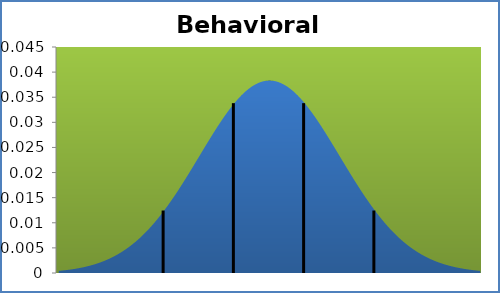
| Category | densité |
|---|---|
| 3.169999999999998 | 0 |
| 3.6904999999999966 | 0 |
| 4.2109999999999985 | 0.001 |
| 4.731499999999997 | 0.001 |
| 5.251999999999995 | 0.001 |
| 5.772500000000001 | 0.001 |
| 6.292999999999999 | 0.001 |
| 6.813499999999998 | 0.001 |
| 7.333999999999996 | 0.001 |
| 7.854500000000002 | 0.001 |
| 8.375 | 0.002 |
| 8.895499999999998 | 0.002 |
| 9.415999999999997 | 0.002 |
| 9.936499999999999 | 0.002 |
| 10.456999999999997 | 0.003 |
| 10.9775 | 0.003 |
| 11.497999999999998 | 0.003 |
| 12.0185 | 0.004 |
| 12.538999999999998 | 0.004 |
| 13.0595 | 0.005 |
| 13.579999999999998 | 0.005 |
| 14.100499999999997 | 0.006 |
| 14.620999999999999 | 0.006 |
| 15.141499999999997 | 0.007 |
| 15.661999999999999 | 0.008 |
| 16.182499999999997 | 0.008 |
| 16.703 | 0.009 |
| 17.223499999999998 | 0.01 |
| 17.744 | 0.011 |
| 18.264499999999998 | 0.012 |
| 18.784999999999997 | 0.012 |
| 19.3055 | 0.013 |
| 19.825999999999997 | 0.014 |
| 20.3465 | 0.015 |
| 20.866999999999997 | 0.016 |
| 21.3875 | 0.018 |
| 21.907999999999998 | 0.019 |
| 22.4285 | 0.02 |
| 22.948999999999998 | 0.021 |
| 23.469499999999996 | 0.022 |
| 23.99 | 0.023 |
| 24.5105 | 0.024 |
| 25.031 | 0.026 |
| 25.551499999999997 | 0.027 |
| 26.072 | 0.028 |
| 26.592499999999998 | 0.029 |
| 27.113 | 0.03 |
| 27.633499999999998 | 0.031 |
| 28.153999999999996 | 0.032 |
| 28.6745 | 0.033 |
| 29.195 | 0.034 |
| 29.7155 | 0.035 |
| 30.235999999999997 | 0.035 |
| 30.7565 | 0.036 |
| 31.276999999999997 | 0.037 |
| 31.7975 | 0.037 |
| 32.318 | 0.038 |
| 32.838499999999996 | 0.038 |
| 33.359 | 0.038 |
| 33.8795 | 0.038 |
| 34.4 | 0.038 |
| 34.9205 | 0.038 |
| 35.440999999999995 | 0.038 |
| 35.9615 | 0.038 |
| 36.482 | 0.038 |
| 37.0025 | 0.037 |
| 37.522999999999996 | 0.037 |
| 38.0435 | 0.036 |
| 38.564 | 0.035 |
| 39.0845 | 0.035 |
| 39.605 | 0.034 |
| 40.1255 | 0.033 |
| 40.646 | 0.032 |
| 41.1665 | 0.031 |
| 41.687 | 0.03 |
| 42.207499999999996 | 0.029 |
| 42.727999999999994 | 0.028 |
| 43.2485 | 0.027 |
| 43.769 | 0.026 |
| 44.2895 | 0.024 |
| 44.81 | 0.023 |
| 45.3305 | 0.022 |
| 45.851 | 0.021 |
| 46.3715 | 0.02 |
| 46.891999999999996 | 0.019 |
| 47.412499999999994 | 0.018 |
| 47.933 | 0.016 |
| 48.4535 | 0.015 |
| 48.974000000000004 | 0.014 |
| 49.4945 | 0.013 |
| 50.015 | 0.012 |
| 50.5355 | 0.012 |
| 51.056 | 0.011 |
| 51.576499999999996 | 0.01 |
| 52.096999999999994 | 0.009 |
| 52.6175 | 0.008 |
| 53.138 | 0.008 |
| 53.658500000000004 | 0.007 |
| 54.179 | 0.006 |
| 54.6995 | 0.006 |
| 55.22 | 0.005 |
| 55.7405 | 0.005 |
| 56.260999999999996 | 0.004 |
| 56.781499999999994 | 0.004 |
| 57.302 | 0.003 |
| 57.8225 | 0.003 |
| 58.343 | 0.003 |
| 58.8635 | 0.002 |
| 59.384 | 0.002 |
| 59.9045 | 0.002 |
| 60.425 | 0.002 |
| 60.945499999999996 | 0.001 |
| 61.466 | 0.001 |
| 61.9865 | 0.001 |
| 62.507 | 0.001 |
| 63.027499999999996 | 0.001 |
| 63.548 | 0.001 |
| 64.0685 | 0.001 |
| 64.589 | 0.001 |
| 65.1095 | 0 |
| 65.63 | 0 |